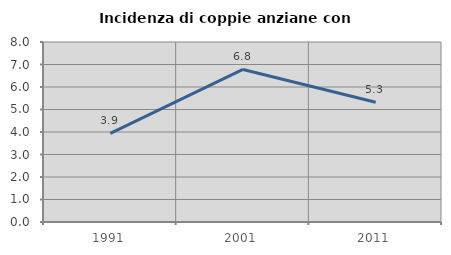
| Category | Incidenza di coppie anziane con figli |
|---|---|
| 1991.0 | 3.934 |
| 2001.0 | 6.78 |
| 2011.0 | 5.319 |